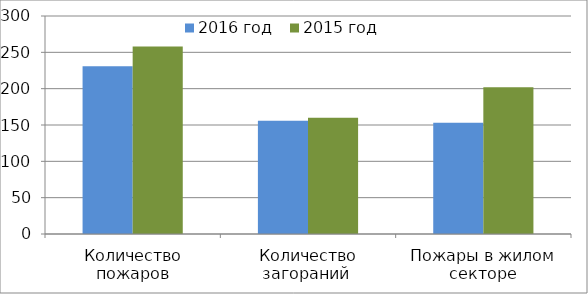
| Category | 2016 год | 2015 год |
|---|---|---|
| Количество пожаров | 231 | 258 |
| Количество загораний  | 156 | 160 |
| Пожары в жилом секторе | 153 | 202 |